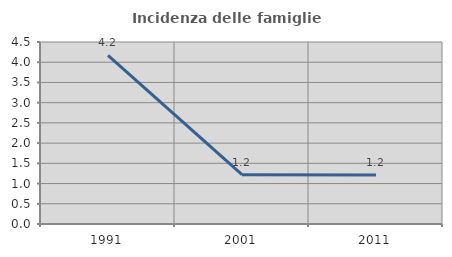
| Category | Incidenza delle famiglie numerose |
|---|---|
| 1991.0 | 4.167 |
| 2001.0 | 1.22 |
| 2011.0 | 1.208 |